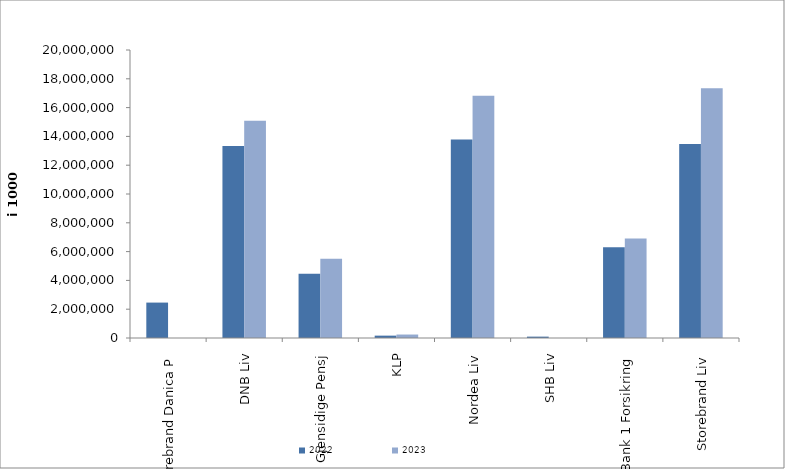
| Category | 2022 | 2023 |
|---|---|---|
| Storebrand Danica P | 2459229.949 | 0 |
| DNB Liv | 13338462.421 | 15081666 |
| Gjensidige Pensj | 4461954 | 5504730 |
| KLP | 163946.055 | 240816.17 |
| Nordea Liv | 13776102.836 | 16814989.589 |
| SHB Liv | 95313 | 0 |
| SpareBank 1 Forsikring | 6297690.694 | 6904691.059 |
| Storebrand Liv | 13470646.969 | 17350621.189 |